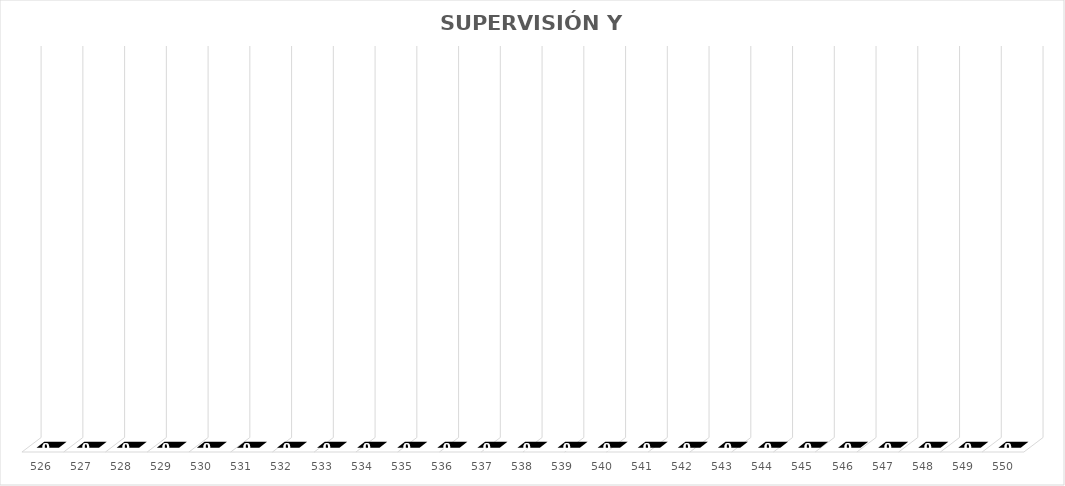
| Category | % Avance |
|---|---|
| 526.0 | 0 |
| 527.0 | 0 |
| 528.0 | 0 |
| 529.0 | 0 |
| 530.0 | 0 |
| 531.0 | 0 |
| 532.0 | 0 |
| 533.0 | 0 |
| 534.0 | 0 |
| 535.0 | 0 |
| 536.0 | 0 |
| 537.0 | 0 |
| 538.0 | 0 |
| 539.0 | 0 |
| 540.0 | 0 |
| 541.0 | 0 |
| 542.0 | 0 |
| 543.0 | 0 |
| 544.0 | 0 |
| 545.0 | 0 |
| 546.0 | 0 |
| 547.0 | 0 |
| 548.0 | 0 |
| 549.0 | 0 |
| 550.0 | 0 |